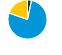
| Category | Series 0 |
|---|---|
| Electricity | 0.032 |
| Natural Gas | 0.771 |
| Distillate Fuel Oil | 0.197 |